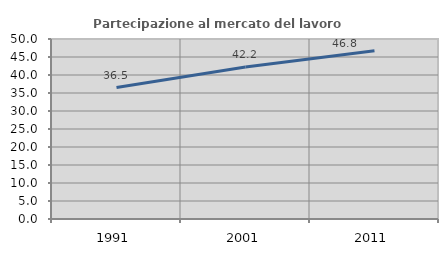
| Category | Partecipazione al mercato del lavoro  femminile |
|---|---|
| 1991.0 | 36.5 |
| 2001.0 | 42.194 |
| 2011.0 | 46.763 |